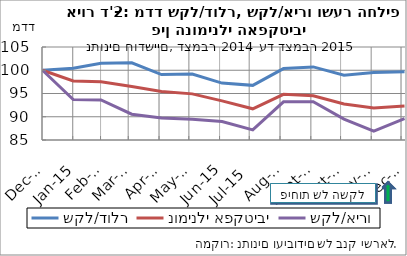
| Category | שקל/דולר | נומינלי אפקטיבי | שקל/אירו |
|---|---|---|---|
| 2014-12-31 | 100 | 100 | 100 |
| 2015-01-31 | 100.409 | 97.686 | 93.713 |
| 2015-02-28 | 101.484 | 97.52 | 93.6 |
| 2015-03-31 | 101.612 | 96.482 | 90.55 |
| 2015-04-30 | 99.079 | 95.448 | 89.708 |
| 2015-05-31 | 99.181 | 94.919 | 89.452 |
| 2015-06-30 | 97.236 | 93.412 | 88.957 |
| 2015-07-31 | 96.75 | 91.704 | 87.187 |
| 2015-08-31 | 100.358 | 94.813 | 93.202 |
| 2015-09-30 | 100.716 | 94.527 | 93.215 |
| 2015-10-31 | 98.951 | 92.735 | 89.508 |
| 2015-11-30 | 99.514 | 91.881 | 86.89 |
| 2015-12-31 | 99.693 | 92.324 | 89.593 |